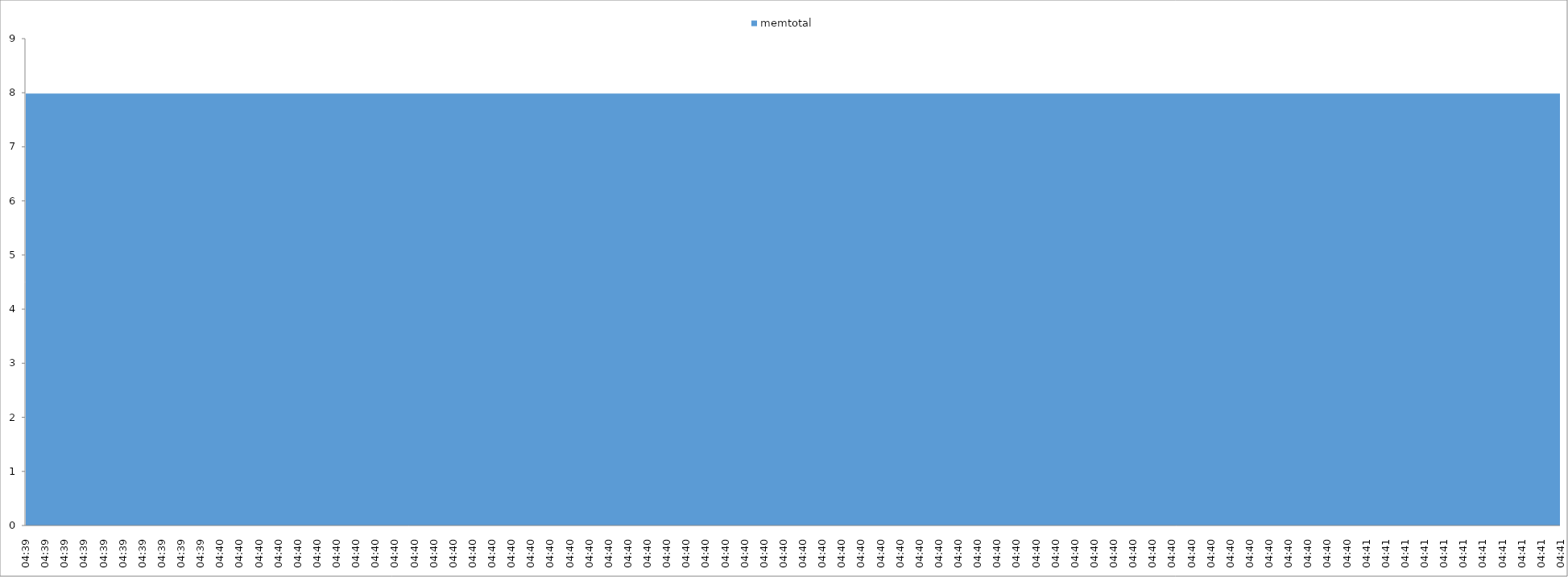
| Category | memtotal |
|---|---|
| 04:39 | 7983.5 |
| 04:39 | 7983.5 |
| 04:39 | 7983.5 |
| 04:39 | 7983.5 |
| 04:39 | 7983.5 |
| 04:39 | 7983.5 |
| 04:39 | 7983.5 |
| 04:39 | 7983.5 |
| 04:39 | 7983.5 |
| 04:39 | 7983.5 |
| 04:40 | 7983.5 |
| 04:40 | 7983.5 |
| 04:40 | 7983.5 |
| 04:40 | 7983.5 |
| 04:40 | 7983.5 |
| 04:40 | 7983.5 |
| 04:40 | 7983.5 |
| 04:40 | 7983.5 |
| 04:40 | 7983.5 |
| 04:40 | 7983.5 |
| 04:40 | 7983.5 |
| 04:40 | 7983.5 |
| 04:40 | 7983.5 |
| 04:40 | 7983.5 |
| 04:40 | 7983.5 |
| 04:40 | 7983.5 |
| 04:40 | 7983.5 |
| 04:40 | 7983.5 |
| 04:40 | 7983.5 |
| 04:40 | 7983.5 |
| 04:40 | 7983.5 |
| 04:40 | 7983.5 |
| 04:40 | 7983.5 |
| 04:40 | 7983.5 |
| 04:40 | 7983.5 |
| 04:40 | 7983.5 |
| 04:40 | 7983.5 |
| 04:40 | 7983.5 |
| 04:40 | 7983.5 |
| 04:40 | 7983.5 |
| 04:40 | 7983.5 |
| 04:40 | 7983.5 |
| 04:40 | 7983.5 |
| 04:40 | 7983.5 |
| 04:40 | 7983.5 |
| 04:40 | 7983.5 |
| 04:40 | 7983.5 |
| 04:40 | 7983.5 |
| 04:40 | 7983.5 |
| 04:40 | 7983.5 |
| 04:40 | 7983.5 |
| 04:40 | 7983.5 |
| 04:40 | 7983.5 |
| 04:40 | 7983.5 |
| 04:40 | 7983.5 |
| 04:40 | 7983.5 |
| 04:40 | 7983.5 |
| 04:40 | 7983.5 |
| 04:40 | 7983.5 |
| 04:40 | 7983.5 |
| 04:40 | 7983.5 |
| 04:40 | 7983.5 |
| 04:40 | 7983.5 |
| 04:40 | 7983.5 |
| 04:40 | 7983.5 |
| 04:40 | 7983.5 |
| 04:40 | 7983.5 |
| 04:40 | 7983.5 |
| 04:40 | 7983.5 |
| 04:41 | 7983.5 |
| 04:41 | 7983.5 |
| 04:41 | 7983.5 |
| 04:41 | 7983.5 |
| 04:41 | 7983.5 |
| 04:41 | 7983.5 |
| 04:41 | 7983.5 |
| 04:41 | 7983.5 |
| 04:41 | 7983.5 |
| 04:41 | 7983.5 |
| 04:41 | 7983.5 |